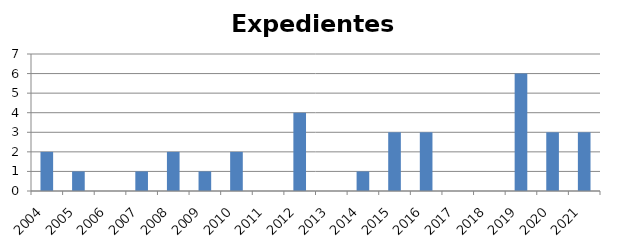
| Category | Expedientes Disciplinarios |
|---|---|
| 2004.0 | 2 |
| 2005.0 | 1 |
| 2006.0 | 0 |
| 2007.0 | 1 |
| 2008.0 | 2 |
| 2009.0 | 1 |
| 2010.0 | 2 |
| 2011.0 | 0 |
| 2012.0 | 4 |
| 2013.0 | 0 |
| 2014.0 | 1 |
| 2015.0 | 3 |
| 2016.0 | 3 |
| 2017.0 | 0 |
| 2018.0 | 0 |
| 2019.0 | 6 |
| 2020.0 | 3 |
| 2021.0 | 3 |